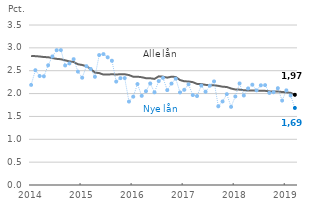
| Category | Alle lån | Nye lån |
|---|---|---|
| 2014-01-01 | 2.823 | 2.189 |
| 2014-02-01 | 2.819 | 2.512 |
| 2014-03-01 | 2.811 | 2.385 |
| 2014-04-01 | 2.799 | 2.378 |
| 2014-05-01 | 2.795 | 2.619 |
| 2014-06-01 | 2.776 | 2.813 |
| 2014-07-01 | 2.759 | 2.949 |
| 2014-08-01 | 2.751 | 2.951 |
| 2014-09-01 | 2.727 | 2.615 |
| 2014-10-01 | 2.705 | 2.659 |
| 2014-11-01 | 2.691 | 2.753 |
| 2014-12-01 | 2.641 | 2.48 |
| 2015-01-01 | 2.626 | 2.347 |
| 2015-02-01 | 2.597 | 2.599 |
| 2015-03-01 | 2.542 | 2.539 |
| 2015-04-01 | 2.458 | 2.367 |
| 2015-05-01 | 2.448 | 2.842 |
| 2015-06-01 | 2.415 | 2.864 |
| 2015-07-01 | 2.419 | 2.794 |
| 2015-08-01 | 2.421 | 2.718 |
| 2015-09-01 | 2.419 | 2.262 |
| 2015-10-01 | 2.421 | 2.337 |
| 2015-11-01 | 2.422 | 2.339 |
| 2015-12-01 | 2.405 | 1.825 |
| 2016-01-01 | 2.369 | 1.932 |
| 2016-02-01 | 2.369 | 2.208 |
| 2016-03-01 | 2.358 | 1.95 |
| 2016-04-01 | 2.337 | 2.053 |
| 2016-05-01 | 2.335 | 2.221 |
| 2016-06-01 | 2.321 | 2.027 |
| 2016-07-01 | 2.377 | 2.274 |
| 2016-08-01 | 2.37 | 2.343 |
| 2016-09-01 | 2.348 | 2.075 |
| 2016-10-01 | 2.37 | 2.219 |
| 2016-11-01 | 2.363 | 2.327 |
| 2016-12-01 | 2.296 | 2.025 |
| 2017-01-01 | 2.269 | 2.083 |
| 2017-02-01 | 2.265 | 2.202 |
| 2017-03-01 | 2.25 | 1.968 |
| 2017-04-01 | 2.211 | 1.946 |
| 2017-05-01 | 2.208 | 2.176 |
| 2017-06-01 | 2.191 | 2.04 |
| 2017-07-01 | 2.18 | 2.172 |
| 2017-08-01 | 2.183 | 2.266 |
| 2017-09-01 | 2.168 | 1.722 |
| 2017-10-01 | 2.151 | 1.827 |
| 2017-11-01 | 2.144 | 1.988 |
| 2017-12-01 | 2.111 | 1.71 |
| 2018-01-01 | 2.089 | 1.937 |
| 2018-02-01 | 2.086 | 2.222 |
| 2018-03-01 | 2.072 | 1.958 |
| 2018-04-01 | 2.068 | 2.112 |
| 2018-05-01 | 2.068 | 2.194 |
| 2018-06-01 | 2.062 | 2.07 |
| 2018-07-01 | 2.06 | 2.181 |
| 2018-08-01 | 2.06 | 2.185 |
| 2018-09-01 | 2.048 | 2.014 |
| 2018-10-01 | 2.045 | 2.03 |
| 2018-11-01 | 2.045 | 2.118 |
| 2018-12-01 | 2.035 | 1.847 |
| 2019-01-01 | 2.027 | 2.071 |
| 2019-02-01 | 2.016 | 1.958 |
| 2019-03-01 | 1.973 | 1.685 |